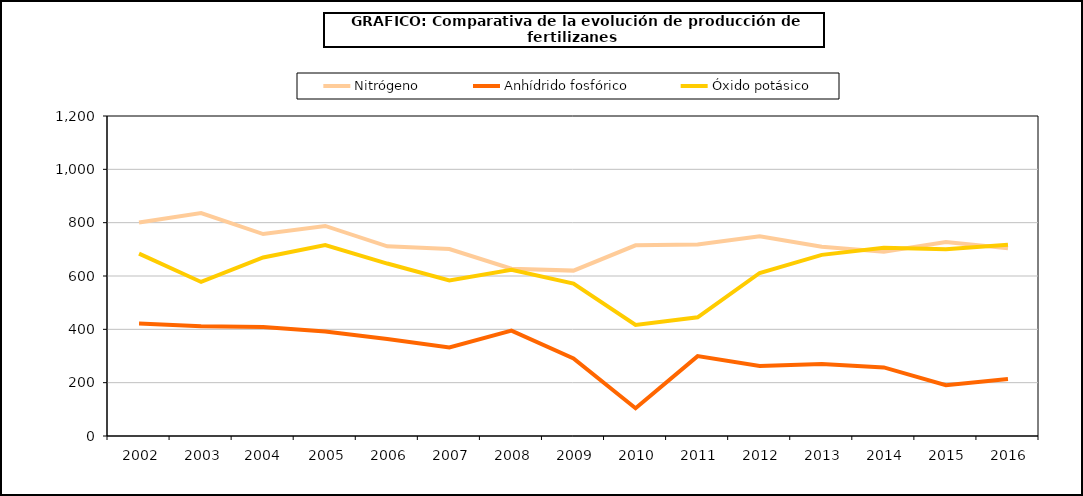
| Category | Nitrógeno | Anhídrido fosfórico | Óxido potásico |
|---|---|---|---|
|   2002 | 800.5 | 421.9 | 684.1 |
|   2003 | 835.9 | 411.4 | 577.7 |
|   2004  | 757.2 | 409.1 | 669.6 |
|   2005 | 787.7 | 391.6 | 715.7 |
|   2006 | 711.4 | 363.889 | 646.714 |
|   2007 | 701.022 | 331.7 | 583.6 |
|   2008 | 627.3 | 394.992 | 623.095 |
|   2009 | 620.2 | 291.1 | 571.7 |
|   2010 | 715 | 104.3 | 416.7 |
|   2011 | 718.1 | 299.5 | 445.3 |
|   2012 | 748.9 | 262.6 | 611.3 |
|   2013 | 710 | 269.7 | 679.2 |
|   2014 | 691.1 | 257.1 | 706.3 |
|   2015 | 727.2 | 190.6 | 700 |
|   2016 | 703.8 | 214 | 717.2 |